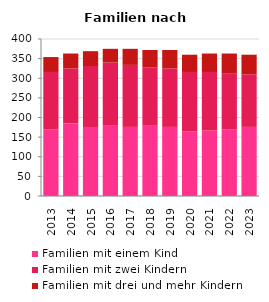
| Category | Familien mit einem Kind | Familien mit zwei Kindern | Familien mit drei und mehr Kindern |
|---|---|---|---|
| 2013.0 | 170 | 146 | 38 |
| 2014.0 | 185 | 140 | 38 |
| 2015.0 | 176 | 155 | 38 |
| 2016.0 | 179 | 161 | 35 |
| 2017.0 | 176 | 158 | 41 |
| 2018.0 | 179 | 149 | 44 |
| 2019.0 | 176 | 149 | 47 |
| 2020.0 | 164 | 152 | 44 |
| 2021.0 | 167 | 149 | 47 |
| 2022.0 | 170 | 143 | 50 |
| 2023.0 | 176 | 134 | 50 |